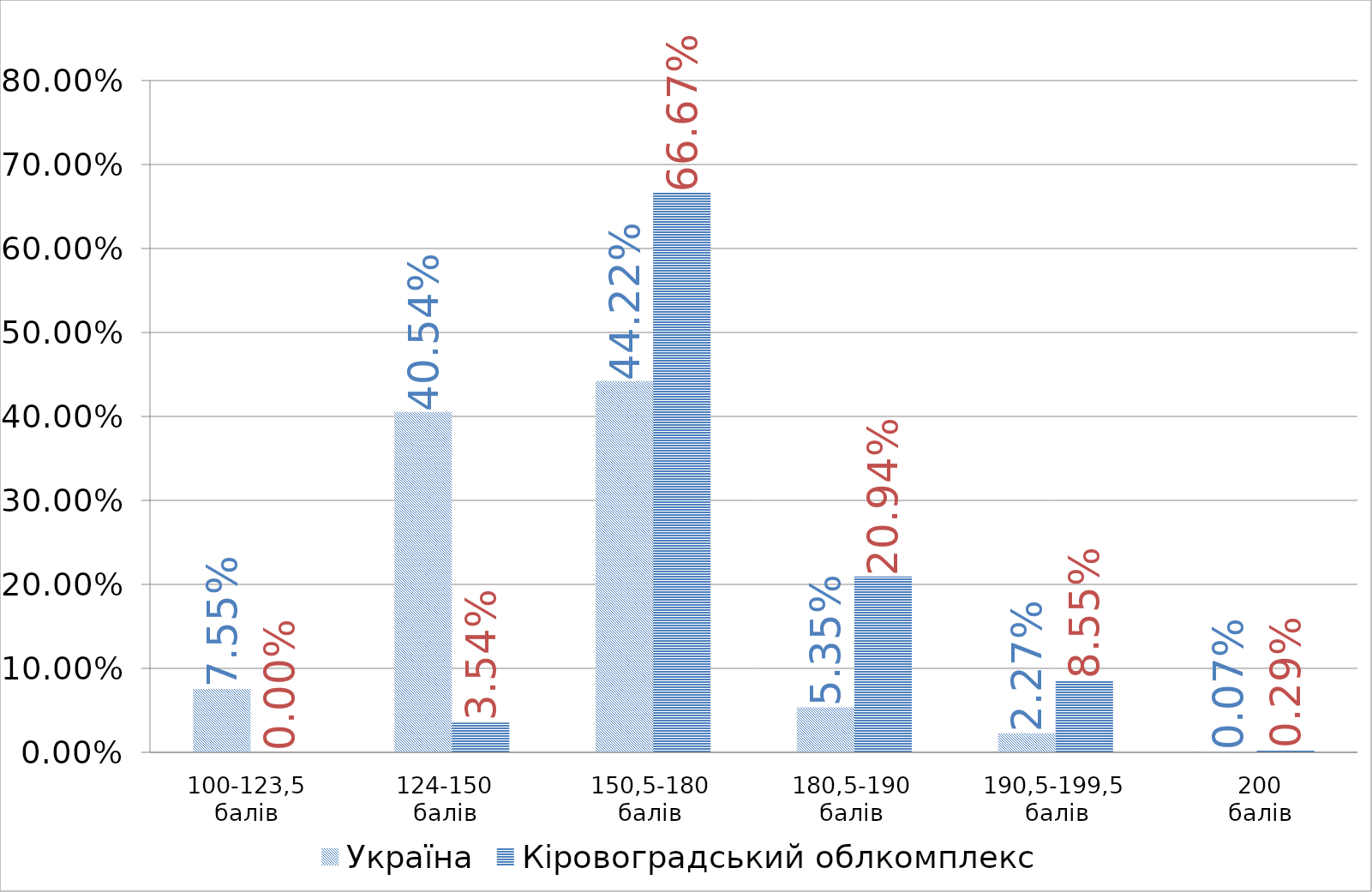
| Category | Україна | Кіровоградський облкомплекс |
|---|---|---|
| 0 | 0.076 | 0 |
| 1 | 0.405 | 0.035 |
| 2 | 0.442 | 0.667 |
| 3 | 0.054 | 0.209 |
| 4 | 0.023 | 0.086 |
| 5 | 0.001 | 0.003 |